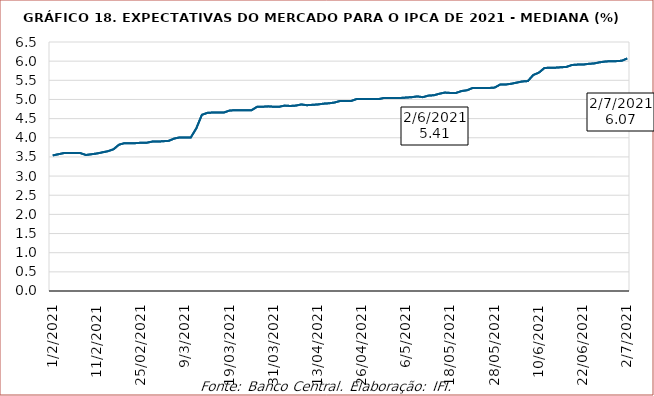
| Category | Series 1 | Series 0 |
|---|---|---|
| 1/2/2021 | 3.54 | 3.54 |
| 2/2/2021 | 3.57 | 3.57 |
| 3/2/2021 | 3.6 | 3.6 |
| 4/2/2021 | 3.6 | 3.6 |
| 5/2/2021 | 3.6 | 3.6 |
| 8/2/2021 | 3.6 | 3.6 |
| 9/2/2021 | 3.55 | 3.55 |
| 10/2/2021 | 3.57 | 3.57 |
| 11/2/2021 | 3.59 | 3.59 |
| 12/2/2021 | 3.62 | 3.62 |
| 17/02/2021 | 3.65 | 3.65 |
| 18/02/2021 | 3.7 | 3.7 |
| 19/02/2021 | 3.82 | 3.82 |
| 22/02/2021 | 3.86 | 3.86 |
| 23/02/2021 | 3.86 | 3.86 |
| 24/02/2021 | 3.86 | 3.86 |
| 25/02/2021 | 3.87 | 3.87 |
| 26/02/2021 | 3.87 | 3.87 |
| 1/3/2021 | 3.9 | 3.9 |
| 2/3/2021 | 3.9 | 3.9 |
| 3/3/2021 | 3.91 | 3.91 |
| 4/3/2021 | 3.92 | 3.92 |
| 5/3/2021 | 3.98 | 3.98 |
| 8/3/2021 | 4.01 | 4.01 |
| 9/3/2021 | 4.01 | 4.01 |
| 10/3/2021 | 4.01 | 4.01 |
| 11/3/2021 | 4.25 | 4.25 |
| 12/3/2021 | 4.6 | 4.6 |
| 15/03/2021 | 4.65 | 4.65 |
| 16/03/2021 | 4.66 | 4.66 |
| 17/03/2021 | 4.66 | 4.66 |
| 18/03/2021 | 4.66 | 4.66 |
| 19/03/2021 | 4.71 | 4.71 |
| 22/03/2021 | 4.72 | 4.72 |
| 23/03/2021 | 4.72 | 4.72 |
| 24/03/2021 | 4.72 | 4.72 |
| 25/03/2021 | 4.72 | 4.72 |
| 26/03/2021 | 4.81 | 4.81 |
| 29/03/2021 | 4.81 | 4.81 |
| 30/03/2021 | 4.82 | 4.82 |
| 31/03/2021 | 4.81 | 4.81 |
| 1/4/2021 | 4.81 | 4.81 |
| 5/4/2021 | 4.84 | 4.84 |
| 6/4/2021 | 4.83 | 4.83 |
| 7/4/2021 | 4.84 | 4.84 |
| 8/4/2021 | 4.87 | 4.87 |
| 9/4/2021 | 4.85 | 4.85 |
| 12/4/2021 | 4.86 | 4.86 |
| 13/04/2021 | 4.87 | 4.87 |
| 14/04/2021 | 4.89 | 4.89 |
| 15/04/2021 | 4.9 | 4.9 |
| 16/04/2021 | 4.92 | 4.92 |
| 19/04/2021 | 4.96 | 4.96 |
| 20/04/2021 | 4.96 | 4.96 |
| 22/04/2021 | 4.96 | 4.96 |
| 23/04/2021 | 5.01 | 5.01 |
| 26/04/2021 | 5.01 | 5.01 |
| 27/04/2021 | 5.01 | 5.01 |
| 28/04/2021 | 5.01 | 5.01 |
| 29/04/2021 | 5.01 | 5.01 |
| 30/04/2021 | 5.04 | 5.04 |
| 3/5/2021 | 5.04 | 5.04 |
| 4/5/2021 | 5.04 | 5.04 |
| 5/5/2021 | 5.04 | 5.04 |
| 6/5/2021 | 5.05 | 5.05 |
| 7/5/2021 | 5.06 | 5.06 |
| 10/5/2021 | 5.08 | 5.08 |
| 11/5/2021 | 5.06 | 5.06 |
| 12/5/2021 | 5.1 | 5.1 |
| 13/05/2021 | 5.11 | 5.11 |
| 14/05/2021 | 5.15 | 5.15 |
| 17/05/2021 | 5.18 | 5.18 |
| 18/05/2021 | 5.17 | 5.17 |
| 19/05/2021 | 5.17 | 5.17 |
| 20/05/2021 | 5.22 | 5.22 |
| 21/05/2021 | 5.24 | 5.24 |
| 24/05/2021 | 5.3 | 5.3 |
| 25/05/2021 | 5.3 | 5.3 |
| 26/05/2021 | 5.3 | 5.3 |
| 27/05/2021 | 5.3 | 5.3 |
| 28/05/2021 | 5.31 | 5.31 |
| 31/05/2021 | 5.39 | 5.39 |
| 1/6/2021 | 5.39 | 5.39 |
| 2/6/2021 | 5.41 | 5.41 |
| 4/6/2021 | 5.44 | 5.44 |
| 7/6/2021 | 5.47 | 5.47 |
| 8/6/2021 | 5.48 | 5.48 |
| 9/6/2021 | 5.64 | 5.64 |
| 10/6/2021 | 5.7 | 5.7 |
| 11/6/2021 | 5.82 | 5.82 |
| 14/06/2021 | 5.83 | 5.83 |
| 15/06/2021 | 5.83 | 5.83 |
| 16/06/2021 | 5.84 | 5.84 |
| 17/06/2021 | 5.85 | 5.85 |
| 18/06/2021 | 5.9 | 5.9 |
| 21/06/2021 | 5.91 | 5.91 |
| 22/06/2021 | 5.91 | 5.91 |
| 23/06/2021 | 5.93 | 5.93 |
| 24/06/2021 | 5.94 | 5.94 |
| 25/06/2021 | 5.97 | 5.97 |
| 28/06/2021 | 5.99 | 5.99 |
| 29/06/2021 | 6 | 6 |
| 30/06/2021 | 6 | 6 |
| 1/7/2021 | 6.01 | 6.01 |
| 2/7/2021 | 6.07 | 6.07 |